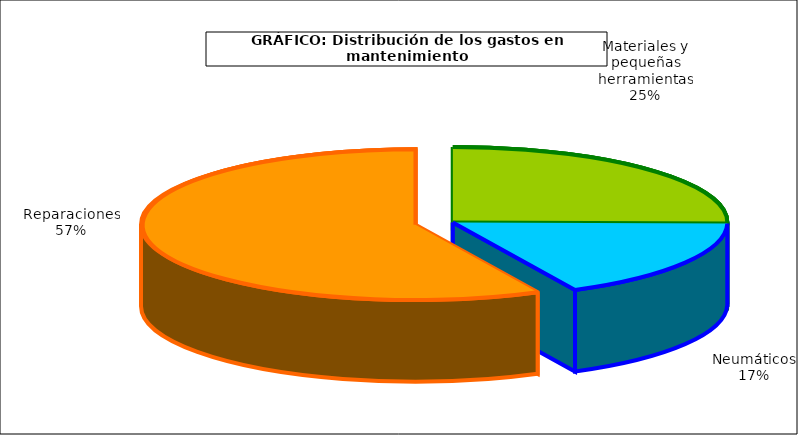
| Category | Series 0 |
|---|---|
| 0 | 489.49 |
| 1 | 338.089 |
| 2 | 1112.479 |